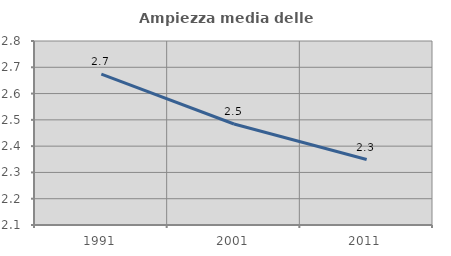
| Category | Ampiezza media delle famiglie |
|---|---|
| 1991.0 | 2.674 |
| 2001.0 | 2.484 |
| 2011.0 | 2.349 |